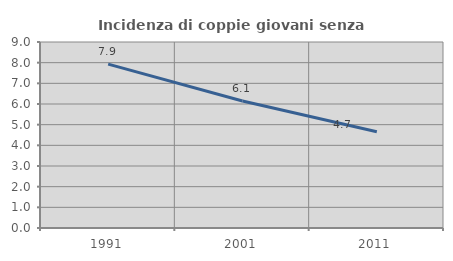
| Category | Incidenza di coppie giovani senza figli |
|---|---|
| 1991.0 | 7.928 |
| 2001.0 | 6.145 |
| 2011.0 | 4.656 |